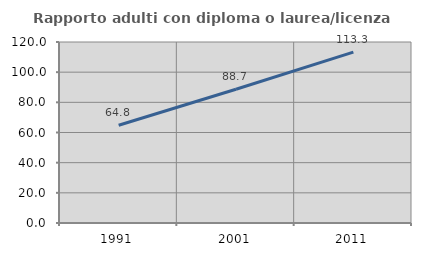
| Category | Rapporto adulti con diploma o laurea/licenza media  |
|---|---|
| 1991.0 | 64.786 |
| 2001.0 | 88.681 |
| 2011.0 | 113.333 |